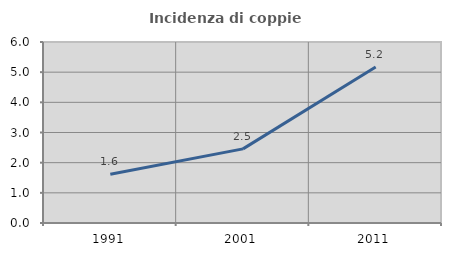
| Category | Incidenza di coppie miste |
|---|---|
| 1991.0 | 1.613 |
| 2001.0 | 2.457 |
| 2011.0 | 5.172 |